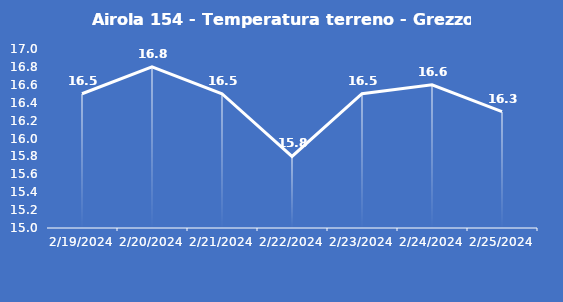
| Category | Airola 154 - Temperatura terreno - Grezzo (°C) |
|---|---|
| 2/19/24 | 16.5 |
| 2/20/24 | 16.8 |
| 2/21/24 | 16.5 |
| 2/22/24 | 15.8 |
| 2/23/24 | 16.5 |
| 2/24/24 | 16.6 |
| 2/25/24 | 16.3 |